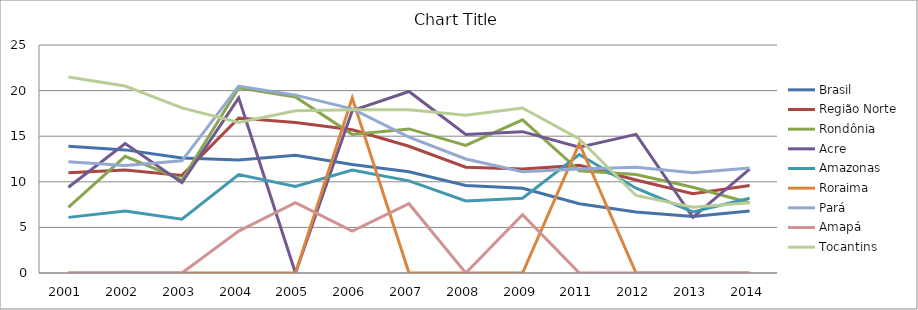
| Category | Brasil | Região Norte | Rondônia | Acre | Amazonas | Roraima | Pará | Amapá | Tocantins |
|---|---|---|---|---|---|---|---|---|---|
| 2001.0 | 13.9 | 11 | 7.2 | 9.4 | 6.1 | 0 | 12.2 | 0 | 21.5 |
| 2002.0 | 13.5 | 11.3 | 12.8 | 14.2 | 6.8 | 0 | 11.8 | 0 | 20.5 |
| 2003.0 | 12.6 | 10.7 | 10.2 | 9.9 | 5.9 | 0 | 12.3 | 0 | 18.1 |
| 2004.0 | 12.4 | 17 | 20.3 | 19.2 | 10.8 | 0 | 20.5 | 4.6 | 16.5 |
| 2005.0 | 12.9 | 16.5 | 19.3 | 0 | 9.5 | 0 | 19.5 | 7.7 | 17.8 |
| 2006.0 | 11.9 | 15.7 | 15.2 | 17.8 | 11.3 | 19.2 | 18 | 4.6 | 17.9 |
| 2007.0 | 11.1 | 13.9 | 15.8 | 19.9 | 10.1 | 0 | 14.9 | 7.6 | 17.9 |
| 2008.0 | 9.6 | 11.6 | 14 | 15.2 | 7.9 | 0 | 12.5 | 0 | 17.3 |
| 2009.0 | 9.3 | 11.4 | 16.8 | 15.5 | 8.2 | 0 | 11.1 | 6.4 | 18.1 |
| 2011.0 | 7.6 | 11.8 | 11.2 | 13.8 | 13 | 14.2 | 11.4 | 0 | 14.7 |
| 2012.0 | 6.7 | 10.2 | 10.8 | 15.2 | 9.3 | 0 | 11.6 | 0 | 8.5 |
| 2013.0 | 6.2 | 8.7 | 9.4 | 6.1 | 6.7 | 0 | 11 | 0 | 7.2 |
| 2014.0 | 6.8 | 9.6 | 7.7 | 11.4 | 8.2 | 0 | 11.5 | 0 | 7.7 |